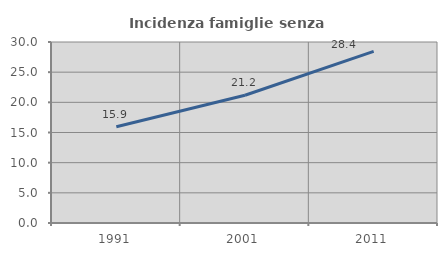
| Category | Incidenza famiglie senza nuclei |
|---|---|
| 1991.0 | 15.944 |
| 2001.0 | 21.172 |
| 2011.0 | 28.442 |